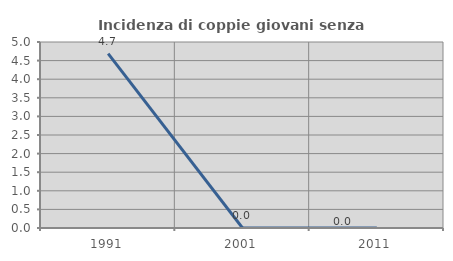
| Category | Incidenza di coppie giovani senza figli |
|---|---|
| 1991.0 | 4.688 |
| 2001.0 | 0 |
| 2011.0 | 0 |